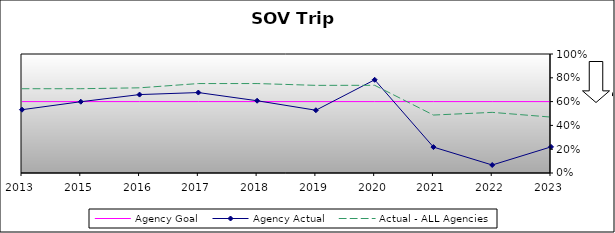
| Category | Agency Goal | Agency Actual | Actual - ALL Agencies |
|---|---|---|---|
| 2013.0 | 0.6 | 0.532 | 0.708 |
| 2015.0 | 0.6 | 0.599 | 0.708 |
| 2016.0 | 0.6 | 0.659 | 0.716 |
| 2017.0 | 0.6 | 0.676 | 0.752 |
| 2018.0 | 0.6 | 0.607 | 0.752 |
| 2019.0 | 0.6 | 0.528 | 0.736 |
| 2020.0 | 0.6 | 0.783 | 0.737 |
| 2021.0 | 0.6 | 0.218 | 0.487 |
| 2022.0 | 0.6 | 0.067 | 0.509 |
| 2023.0 | 0.6 | 0.22 | 0.47 |